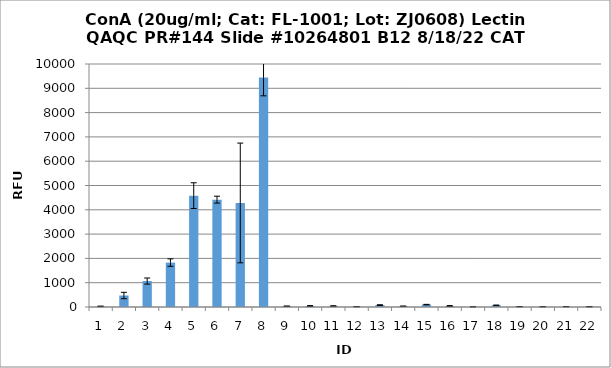
| Category | Series 0 |
|---|---|
| 0 | 26.75 |
| 1 | 472.75 |
| 2 | 1067.75 |
| 3 | 1827.5 |
| 4 | 4582.25 |
| 5 | 4418.25 |
| 6 | 4281.75 |
| 7 | 9446 |
| 8 | 32.75 |
| 9 | 40.25 |
| 10 | 40.75 |
| 11 | 13.25 |
| 12 | 78 |
| 13 | 32 |
| 14 | 98.5 |
| 15 | 40.75 |
| 16 | 8.75 |
| 17 | 68 |
| 18 | 14 |
| 19 | 11.5 |
| 20 | 14 |
| 21 | 13 |